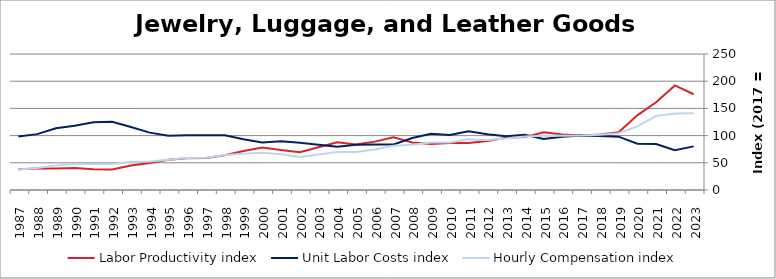
| Category | Labor Productivity index | Unit Labor Costs index | Hourly Compensation index |
|---|---|---|---|
| 2023.0 | 175.963 | 80.183 | 141.092 |
| 2022.0 | 192.165 | 73.132 | 140.533 |
| 2021.0 | 161.216 | 84.367 | 136.014 |
| 2020.0 | 137.218 | 85.22 | 116.938 |
| 2019.0 | 106.272 | 98.058 | 104.208 |
| 2018.0 | 102.041 | 99.466 | 101.495 |
| 2017.0 | 100 | 100 | 100 |
| 2016.0 | 101.973 | 97.932 | 99.865 |
| 2015.0 | 106.27 | 93.949 | 99.84 |
| 2014.0 | 97.222 | 101.344 | 98.529 |
| 2013.0 | 95.893 | 98.652 | 94.6 |
| 2012.0 | 89.96 | 102.367 | 92.089 |
| 2011.0 | 86.415 | 107.925 | 93.263 |
| 2010.0 | 86.389 | 101.029 | 87.278 |
| 2009.0 | 84.406 | 103.372 | 87.253 |
| 2008.0 | 87.296 | 95.456 | 83.329 |
| 2007.0 | 96.859 | 83.767 | 81.136 |
| 2006.0 | 88.927 | 83.614 | 74.356 |
| 2005.0 | 83.818 | 83.284 | 69.807 |
| 2004.0 | 87.656 | 79.537 | 69.719 |
| 2003.0 | 78.464 | 83.275 | 65.341 |
| 2002.0 | 69.556 | 86.97 | 60.493 |
| 2001.0 | 73.336 | 89.696 | 65.78 |
| 2000.0 | 78.236 | 87.435 | 68.406 |
| 1999.0 | 71.781 | 93.149 | 66.864 |
| 1998.0 | 63.911 | 100.529 | 64.249 |
| 1997.0 | 58.908 | 100.453 | 59.175 |
| 1996.0 | 58.417 | 100.698 | 58.825 |
| 1995.0 | 55.754 | 99.695 | 55.584 |
| 1994.0 | 49.771 | 105.477 | 52.497 |
| 1993.0 | 45.034 | 115.821 | 52.159 |
| 1992.0 | 37.684 | 125.529 | 47.304 |
| 1991.0 | 38.309 | 124.44 | 47.672 |
| 1990.0 | 40.377 | 118.024 | 47.655 |
| 1989.0 | 39.588 | 113.33 | 44.865 |
| 1988.0 | 39.342 | 102.695 | 40.402 |
| 1987.0 | 38.259 | 98.366 | 37.634 |